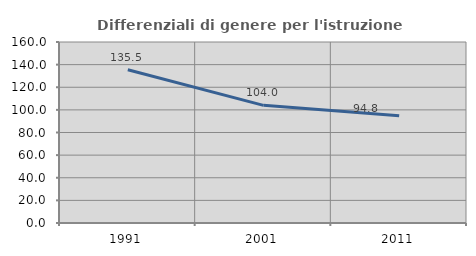
| Category | Differenziali di genere per l'istruzione superiore |
|---|---|
| 1991.0 | 135.476 |
| 2001.0 | 104.003 |
| 2011.0 | 94.795 |